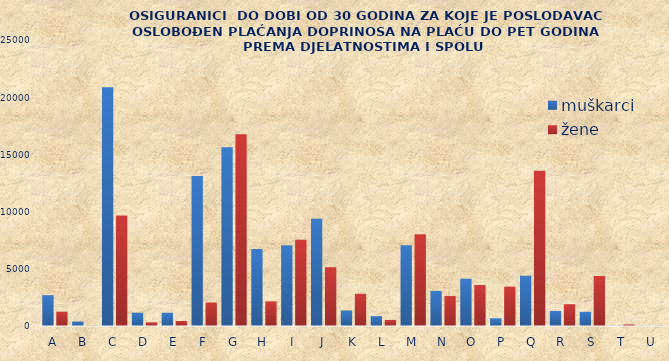
| Category | muškarci | žene |
|---|---|---|
| A | 2695 | 1247 |
| B | 387 | 36 |
| C | 20866 | 9668 |
| D | 1159 | 321 |
| E | 1154 | 436 |
| F | 13122 | 2057 |
| G | 15635 | 16753 |
| H | 6727 | 2158 |
| I | 7052 | 7540 |
| J | 9382 | 5136 |
| K | 1351 | 2809 |
| L | 864 | 531 |
| M | 7058 | 8016 |
| N | 3067 | 2619 |
| O | 4129 | 3581 |
| P | 673 | 3436 |
| Q | 4390 | 13580 |
| R | 1319 | 1904 |
| S | 1236 | 4371 |
| T | 26 | 131 |
| U | 14 | 21 |